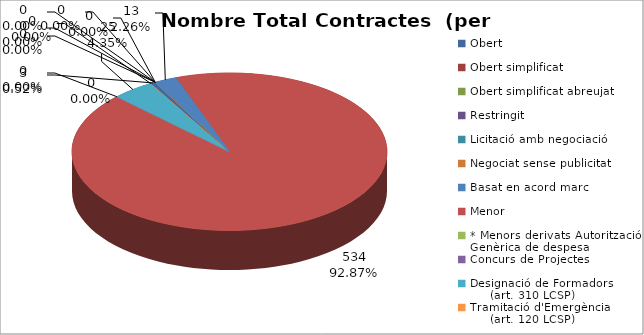
| Category | Nombre Total Contractes |
|---|---|
| Obert | 3 |
| Obert simplificat | 0 |
| Obert simplificat abreujat | 0 |
| Restringit | 0 |
| Licitació amb negociació | 0 |
| Negociat sense publicitat | 0 |
| Basat en acord marc | 13 |
| Menor | 534 |
| * Menors derivats Autorització Genèrica de despesa | 0 |
| Concurs de Projectes | 0 |
| Designació de Formadors
     (art. 310 LCSP) | 25 |
| Tramitació d'Emergència
     (art. 120 LCSP) | 0 |